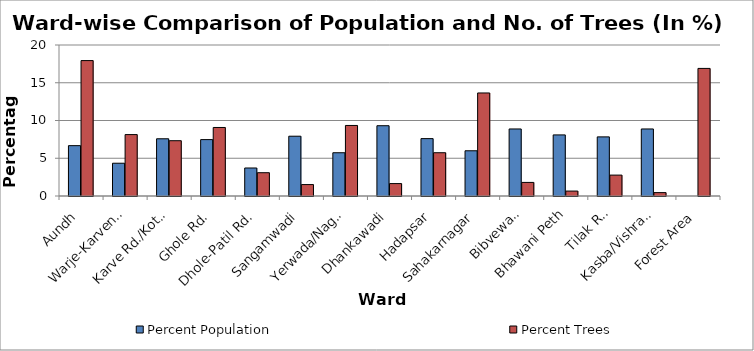
| Category | Percent Population | Percent Trees |
|---|---|---|
| Aundh | 6.67 | 17.936 |
| Warje-Karvenagar | 4.34 | 8.134 |
| Karve Rd./Kothrud | 7.58 | 7.323 |
| Ghole Rd. | 7.47 | 9.075 |
| Dhole-Patil Rd. | 3.71 | 3.084 |
| Sangamwadi | 7.92 | 1.515 |
| Yerwada/Nagar Rd. | 5.73 | 9.344 |
| Dhankawadi | 9.31 | 1.644 |
| Hadapsar | 7.6 | 5.731 |
| Sahakarnagar | 5.99 | 13.648 |
| Bibvewadi | 8.88 | 1.799 |
| Bhawani Peth | 8.09 | 0.652 |
| Tilak Rd. | 7.83 | 2.767 |
| Kasba/Vishrambaugwada | 8.88 | 0.448 |
| Forest Area | 0 | 16.9 |